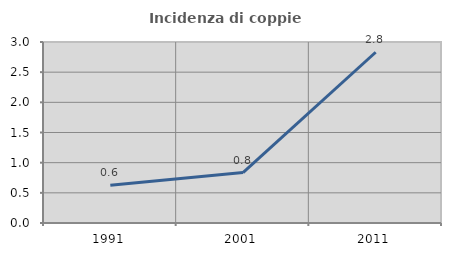
| Category | Incidenza di coppie miste |
|---|---|
| 1991.0 | 0.627 |
| 2001.0 | 0.835 |
| 2011.0 | 2.83 |